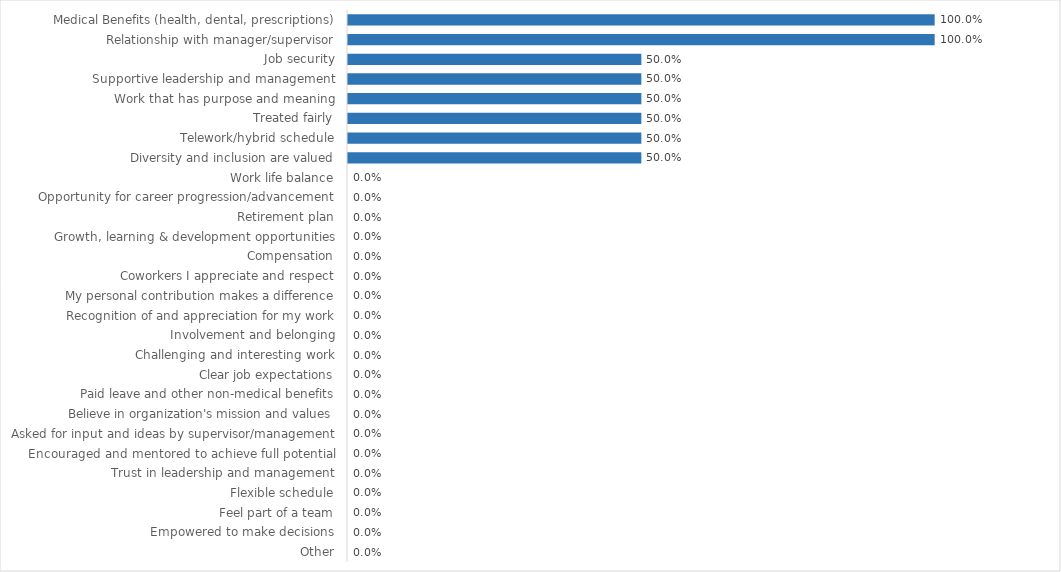
| Category | Vermont Commission on Women |
|---|---|
| Medical Benefits (health, dental, prescriptions) | 1 |
| Relationship with manager/supervisor | 1 |
| Job security | 0.5 |
| Supportive leadership and management | 0.5 |
| Work that has purpose and meaning | 0.5 |
| Treated fairly | 0.5 |
| Telework/hybrid schedule | 0.5 |
| Diversity and inclusion are valued | 0.5 |
| Work life balance | 0 |
| Opportunity for career progression/advancement | 0 |
| Retirement plan | 0 |
| Growth, learning & development opportunities | 0 |
| Compensation | 0 |
| Coworkers I appreciate and respect | 0 |
| My personal contribution makes a difference | 0 |
| Recognition of and appreciation for my work | 0 |
| Involvement and belonging | 0 |
| Challenging and interesting work | 0 |
| Clear job expectations | 0 |
| Paid leave and other non-medical benefits | 0 |
| Believe in organization's mission and values | 0 |
| Asked for input and ideas by supervisor/management | 0 |
| Encouraged and mentored to achieve full potential | 0 |
| Trust in leadership and management | 0 |
| Flexible schedule | 0 |
| Feel part of a team | 0 |
| Empowered to make decisions | 0 |
| Other | 0 |